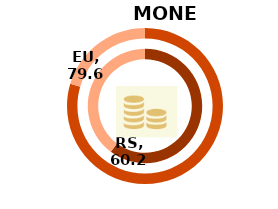
| Category | RS | Series 1 | EU |
|---|---|---|---|
| Index | 60.2 |  | 79.6 |
| Rest | 39.8 |  | 20.4 |